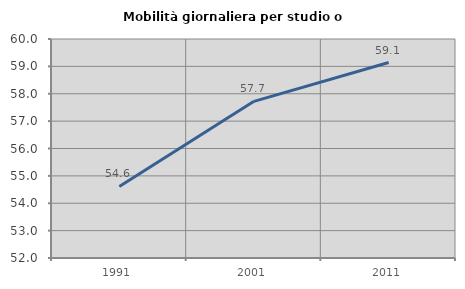
| Category | Mobilità giornaliera per studio o lavoro |
|---|---|
| 1991.0 | 54.614 |
| 2001.0 | 57.724 |
| 2011.0 | 59.14 |